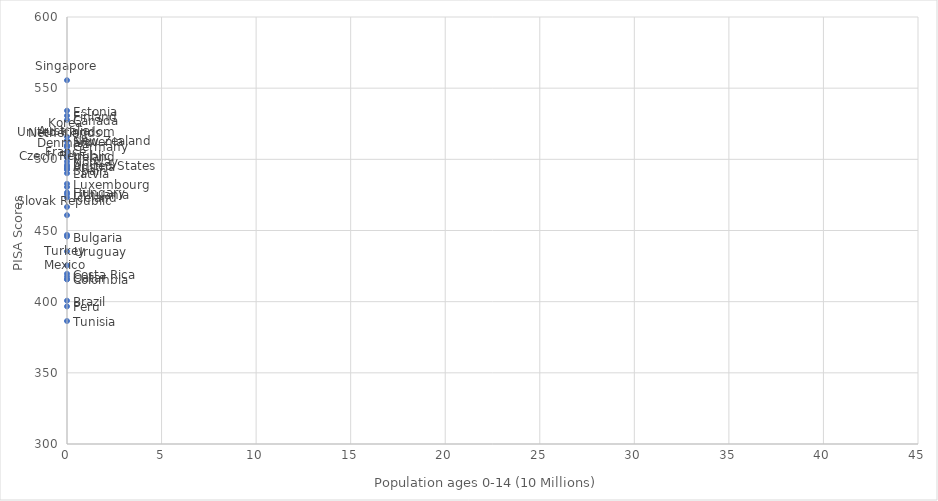
| Category | Series 0 |
|---|---|
| 0 | 509.994 |
| 1 | 495.037 |
| 2 | 400.682 |
| 3 | 445.772 |
| 4 | 527.705 |
| 5 | 446.956 |
| 6 | 415.729 |
| 7 | 419.608 |
| 8 | 492.83 |
| 9 | 501.937 |
| 10 | 534.194 |
| 11 | 530.661 |
| 12 | 494.978 |
| 13 | 509.141 |
| 14 | 476.748 |
| 15 | 473.23 |
| 16 | 502.575 |
| 17 | 466.553 |
| 18 | 480.547 |
| 19 | 515.81 |
| 20 | 490.225 |
| 21 | 475.409 |
| 22 | 482.806 |
| 23 | 415.71 |
| 24 | 508.575 |
| 25 | 513.304 |
| 26 | 498.481 |
| 27 | 396.684 |
| 28 | 501.435 |
| 29 | 501.1 |
| 30 | 417.611 |
| 31 | 555.575 |
| 32 | 460.775 |
| 33 | 512.864 |
| 34 | 492.786 |
| 35 | 493.422 |
| 36 | 505.506 |
| 37 | 386.403 |
| 38 | 425.49 |
| 39 | 509.222 |
| 40 | 496.242 |
| 41 | 435.363 |